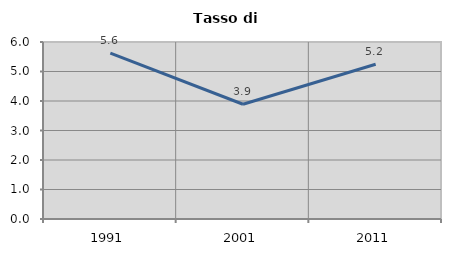
| Category | Tasso di disoccupazione   |
|---|---|
| 1991.0 | 5.622 |
| 2001.0 | 3.89 |
| 2011.0 | 5.247 |